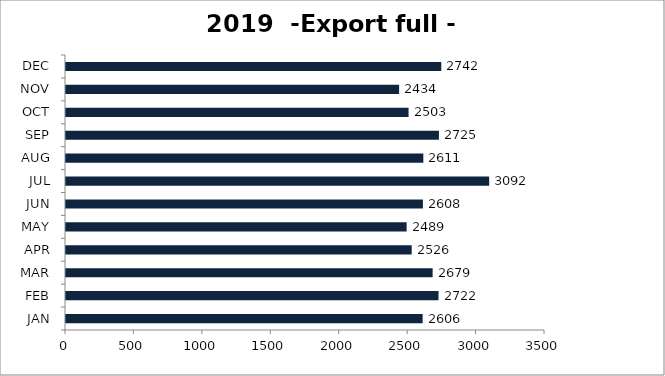
| Category | Export full - 40' |
|---|---|
| JAN | 2606 |
| FEB | 2722 |
| MAR | 2679 |
| APR | 2526 |
| MAY | 2489 |
| JUN | 2608 |
| JUL | 3092 |
| AUG | 2611 |
| SEP | 2725 |
| OCT | 2503 |
| NOV | 2434 |
| DEC | 2742 |